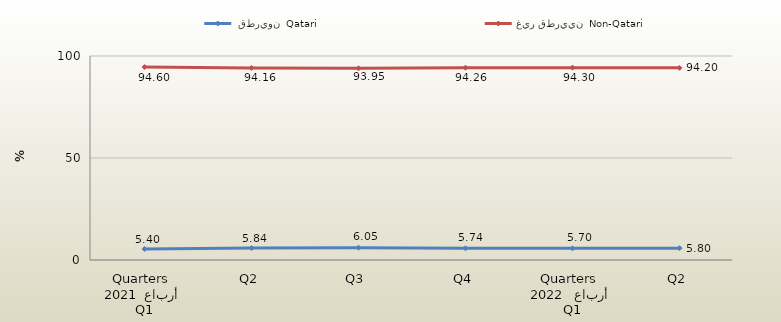
| Category |  قطريون  Qatari | غير قطريين  Non-Qatari |
|---|---|---|
| 0 | 5.404 | 94.596 |
| 1 | 5.836 | 94.164 |
| 2 | 6.047 | 93.953 |
| 3 | 5.737 | 94.263 |
| 4 | 5.7 | 94.3 |
| 5 | 5.8 | 94.2 |